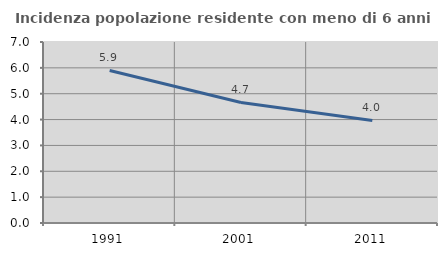
| Category | Incidenza popolazione residente con meno di 6 anni |
|---|---|
| 1991.0 | 5.899 |
| 2001.0 | 4.662 |
| 2011.0 | 3.966 |